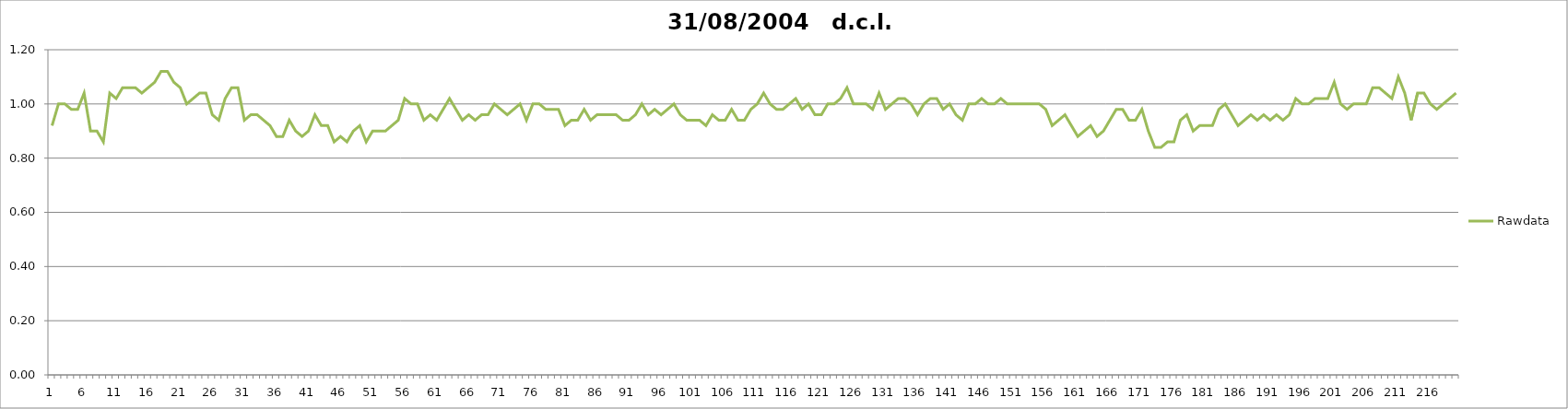
| Category | Rawdata |
|---|---|
| 0 | 0.92 |
| 1 | 1 |
| 2 | 1 |
| 3 | 0.98 |
| 4 | 0.98 |
| 5 | 1.04 |
| 6 | 0.9 |
| 7 | 0.9 |
| 8 | 0.86 |
| 9 | 1.04 |
| 10 | 1.02 |
| 11 | 1.06 |
| 12 | 1.06 |
| 13 | 1.06 |
| 14 | 1.04 |
| 15 | 1.06 |
| 16 | 1.08 |
| 17 | 1.12 |
| 18 | 1.12 |
| 19 | 1.08 |
| 20 | 1.06 |
| 21 | 1 |
| 22 | 1.02 |
| 23 | 1.04 |
| 24 | 1.04 |
| 25 | 0.96 |
| 26 | 0.94 |
| 27 | 1.02 |
| 28 | 1.06 |
| 29 | 1.06 |
| 30 | 0.94 |
| 31 | 0.96 |
| 32 | 0.96 |
| 33 | 0.94 |
| 34 | 0.92 |
| 35 | 0.88 |
| 36 | 0.88 |
| 37 | 0.94 |
| 38 | 0.9 |
| 39 | 0.88 |
| 40 | 0.9 |
| 41 | 0.96 |
| 42 | 0.92 |
| 43 | 0.92 |
| 44 | 0.86 |
| 45 | 0.88 |
| 46 | 0.86 |
| 47 | 0.9 |
| 48 | 0.92 |
| 49 | 0.86 |
| 50 | 0.9 |
| 51 | 0.9 |
| 52 | 0.9 |
| 53 | 0.92 |
| 54 | 0.94 |
| 55 | 1.02 |
| 56 | 1 |
| 57 | 1 |
| 58 | 0.94 |
| 59 | 0.96 |
| 60 | 0.94 |
| 61 | 0.98 |
| 62 | 1.02 |
| 63 | 0.98 |
| 64 | 0.94 |
| 65 | 0.96 |
| 66 | 0.94 |
| 67 | 0.96 |
| 68 | 0.96 |
| 69 | 1 |
| 70 | 0.98 |
| 71 | 0.96 |
| 72 | 0.98 |
| 73 | 1 |
| 74 | 0.94 |
| 75 | 1 |
| 76 | 1 |
| 77 | 0.98 |
| 78 | 0.98 |
| 79 | 0.98 |
| 80 | 0.92 |
| 81 | 0.94 |
| 82 | 0.94 |
| 83 | 0.98 |
| 84 | 0.94 |
| 85 | 0.96 |
| 86 | 0.96 |
| 87 | 0.96 |
| 88 | 0.96 |
| 89 | 0.94 |
| 90 | 0.94 |
| 91 | 0.96 |
| 92 | 1 |
| 93 | 0.96 |
| 94 | 0.98 |
| 95 | 0.96 |
| 96 | 0.98 |
| 97 | 1 |
| 98 | 0.96 |
| 99 | 0.94 |
| 100 | 0.94 |
| 101 | 0.94 |
| 102 | 0.92 |
| 103 | 0.96 |
| 104 | 0.94 |
| 105 | 0.94 |
| 106 | 0.98 |
| 107 | 0.94 |
| 108 | 0.94 |
| 109 | 0.98 |
| 110 | 1 |
| 111 | 1.04 |
| 112 | 1 |
| 113 | 0.98 |
| 114 | 0.98 |
| 115 | 1 |
| 116 | 1.02 |
| 117 | 0.98 |
| 118 | 1 |
| 119 | 0.96 |
| 120 | 0.96 |
| 121 | 1 |
| 122 | 1 |
| 123 | 1.02 |
| 124 | 1.06 |
| 125 | 1 |
| 126 | 1 |
| 127 | 1 |
| 128 | 0.98 |
| 129 | 1.04 |
| 130 | 0.98 |
| 131 | 1 |
| 132 | 1.02 |
| 133 | 1.02 |
| 134 | 1 |
| 135 | 0.96 |
| 136 | 1 |
| 137 | 1.02 |
| 138 | 1.02 |
| 139 | 0.98 |
| 140 | 1 |
| 141 | 0.96 |
| 142 | 0.94 |
| 143 | 1 |
| 144 | 1 |
| 145 | 1.02 |
| 146 | 1 |
| 147 | 1 |
| 148 | 1.02 |
| 149 | 1 |
| 150 | 1 |
| 151 | 1 |
| 152 | 1 |
| 153 | 1 |
| 154 | 1 |
| 155 | 0.98 |
| 156 | 0.92 |
| 157 | 0.94 |
| 158 | 0.96 |
| 159 | 0.92 |
| 160 | 0.88 |
| 161 | 0.9 |
| 162 | 0.92 |
| 163 | 0.88 |
| 164 | 0.9 |
| 165 | 0.94 |
| 166 | 0.98 |
| 167 | 0.98 |
| 168 | 0.94 |
| 169 | 0.94 |
| 170 | 0.98 |
| 171 | 0.9 |
| 172 | 0.84 |
| 173 | 0.84 |
| 174 | 0.86 |
| 175 | 0.86 |
| 176 | 0.94 |
| 177 | 0.96 |
| 178 | 0.9 |
| 179 | 0.92 |
| 180 | 0.92 |
| 181 | 0.92 |
| 182 | 0.98 |
| 183 | 1 |
| 184 | 0.96 |
| 185 | 0.92 |
| 186 | 0.94 |
| 187 | 0.96 |
| 188 | 0.94 |
| 189 | 0.96 |
| 190 | 0.94 |
| 191 | 0.96 |
| 192 | 0.94 |
| 193 | 0.96 |
| 194 | 1.02 |
| 195 | 1 |
| 196 | 1 |
| 197 | 1.02 |
| 198 | 1.02 |
| 199 | 1.02 |
| 200 | 1.08 |
| 201 | 1 |
| 202 | 0.98 |
| 203 | 1 |
| 204 | 1 |
| 205 | 1 |
| 206 | 1.06 |
| 207 | 1.06 |
| 208 | 1.04 |
| 209 | 1.02 |
| 210 | 1.1 |
| 211 | 1.04 |
| 212 | 0.94 |
| 213 | 1.04 |
| 214 | 1.04 |
| 215 | 1 |
| 216 | 0.98 |
| 217 | 1 |
| 218 | 1.02 |
| 219 | 1.04 |